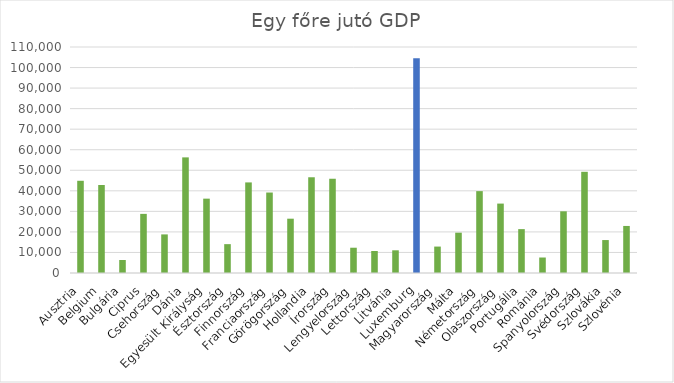
| Category | Series 0 |
|---|---|
| Ausztria | 44885 |
| Belgium | 42833 |
| Bulgária | 6335 |
| Ciprus | 28779 |
| Csehország | 18789 |
| Dánia | 56278 |
| Egyesült Királyság | 36186 |
| Észtország | 14045 |
| Finnország | 44091 |
| Franciaország | 39170 |
| Görögország | 26433 |
| Hollandia | 46597 |
| Írország | 45873 |
| Lengyelország | 12303 |
| Lettország | 10723 |
| Litvánia | 11046 |
| Luxemburg | 104512 |
| Magyarország | 12863 |
| Málta | 19625 |
| Németország | 39852 |
| Olaszország | 33788 |
| Portugália | 21358 |
| Románia | 7539 |
| Spanyolország | 30026 |
| Svédország | 49257 |
| Szlovákia | 16036 |
| Szlovénia | 22898 |